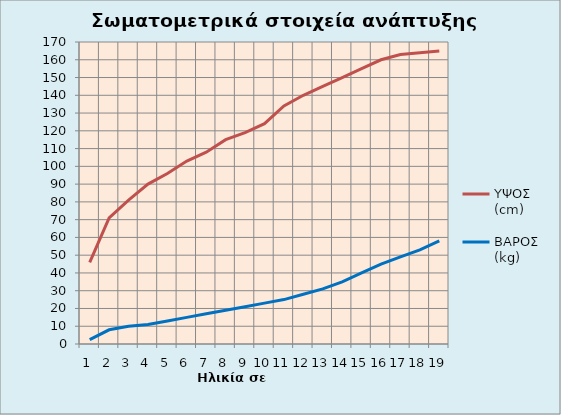
| Category | ΥΨΟΣ (cm) | ΒΑΡΟΣ (kg) |
|---|---|---|
| 0 | 46 | 2.5 |
| 1 | 71 | 8 |
| 2 | 81 | 10 |
| 3 | 90 | 11 |
| 4 | 96 | 13 |
| 5 | 103 | 15 |
| 6 | 108 | 17 |
| 7 | 115 | 19 |
| 8 | 119 | 21 |
| 9 | 124 | 23 |
| 10 | 134 | 25 |
| 11 | 140 | 28 |
| 12 | 145 | 31 |
| 13 | 150 | 35 |
| 14 | 155 | 40 |
| 15 | 160 | 45 |
| 16 | 163 | 49 |
| 17 | 164 | 53 |
| 18 | 165 | 58 |